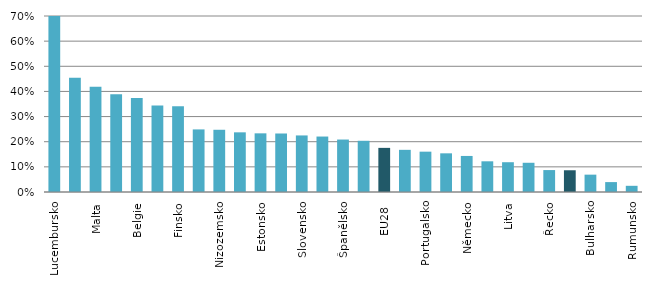
| Category | Series 0 |
|---|---|
| Lucembursko | 0.704 |
| Rakousko | 0.455 |
| Malta | 0.419 |
| Dánsko | 0.389 |
| Belgie | 0.374 |
| Irsko | 0.344 |
| Finsko | 0.341 |
| Švédsko | 0.249 |
| Nizozemsko | 0.247 |
| Kypr | 0.237 |
| Estonsko | 0.233 |
| Velká Británie | 0.233 |
| Slovensko | 0.225 |
| Francie | 0.221 |
| Španělsko | 0.209 |
| Lotyšsko | 0.204 |
| EU28  | 0.175 |
| Slovinsko | 0.168 |
| Portugalsko | 0.16 |
| Chorvatsko | 0.154 |
| Německo | 0.143 |
| Maďarsko | 0.122 |
| Litva | 0.118 |
| Itálie | 0.116 |
| Řecko | 0.087 |
| Česko | 0.086 |
| Bulharsko | 0.069 |
| Polsko | 0.039 |
| Rumunsko | 0.025 |